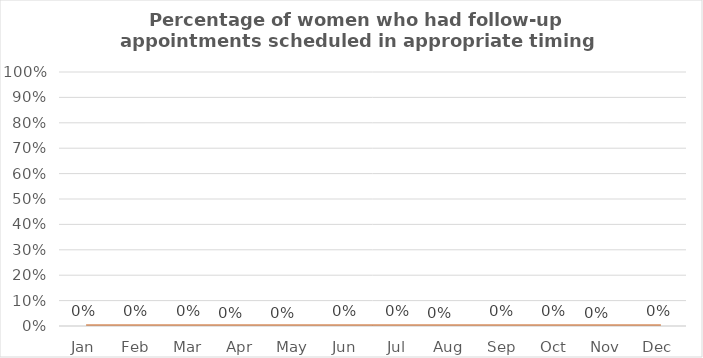
| Category | Percentage of women who had follow-up appointments scheduled in appropriate timing |
|---|---|
| Jan | 0 |
| Feb | 0 |
| Mar | 0 |
| Apr | 0 |
| May | 0 |
| Jun | 0 |
| Jul | 0 |
| Aug | 0 |
| Sep | 0 |
| Oct | 0 |
| Nov | 0 |
| Dec | 0 |